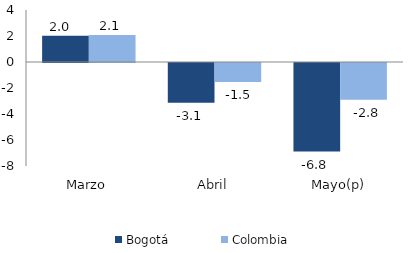
| Category | Bogotá | Colombia |
|---|---|---|
| Marzo | 2.019 | 2.086 |
| Abril | -3.066 | -1.463 |
| Mayo(p) | -6.812 | -2.833 |